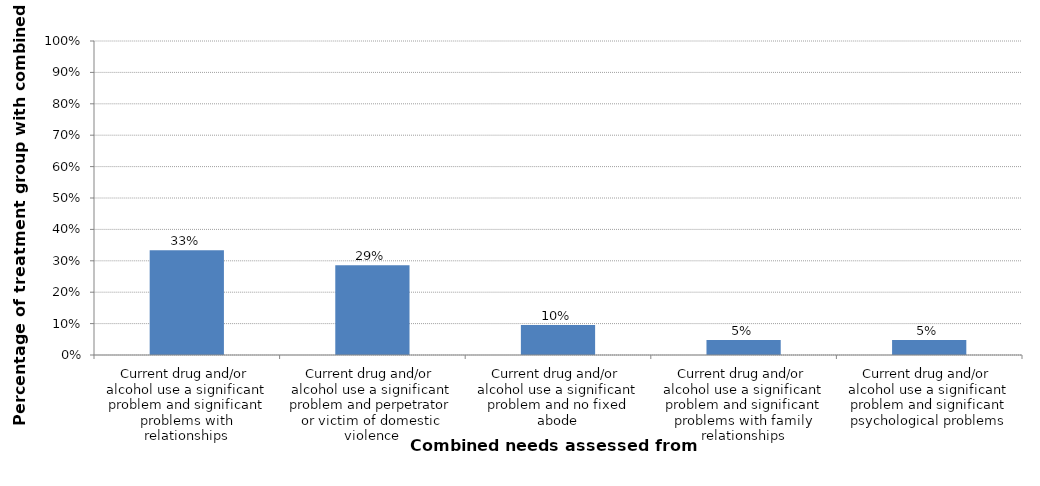
| Category | Percentage of treatment group with combined need |
|---|---|
| Current drug and/or alcohol use a significant problem and significant problems with relationships | 0.333 |
| Current drug and/or alcohol use a significant problem and perpetrator or victim of domestic violence | 0.286 |
| Current drug and/or alcohol use a significant problem and no fixed abode | 0.095 |
| Current drug and/or alcohol use a significant problem and significant problems with family relationships | 0.048 |
| Current drug and/or alcohol use a significant problem and significant psychological problems | 0.048 |